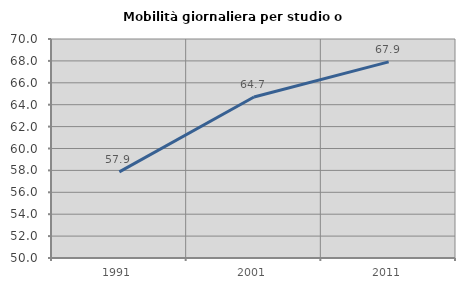
| Category | Mobilità giornaliera per studio o lavoro |
|---|---|
| 1991.0 | 57.861 |
| 2001.0 | 64.706 |
| 2011.0 | 67.911 |